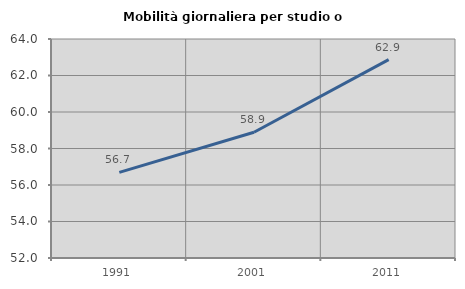
| Category | Mobilità giornaliera per studio o lavoro |
|---|---|
| 1991.0 | 56.693 |
| 2001.0 | 58.891 |
| 2011.0 | 62.87 |